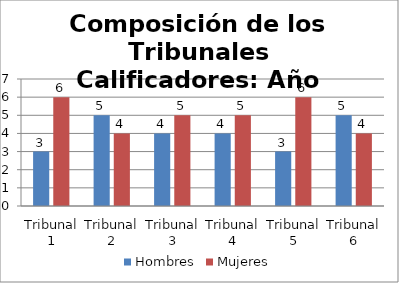
| Category | Hombres | Mujeres |
|---|---|---|
| Tribunal 1 | 3 | 6 |
| Tribunal 2 | 5 | 4 |
| Tribunal 3 | 4 | 5 |
| Tribunal 4 | 4 | 5 |
| Tribunal 5 | 3 | 6 |
| Tribunal 6 | 5 | 4 |